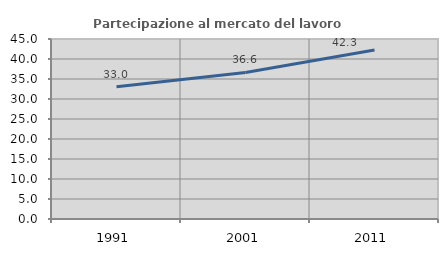
| Category | Partecipazione al mercato del lavoro  femminile |
|---|---|
| 1991.0 | 33.036 |
| 2001.0 | 36.643 |
| 2011.0 | 42.254 |